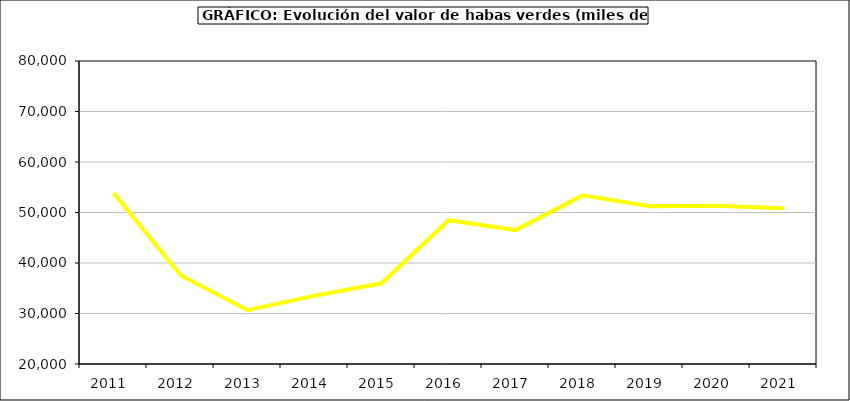
| Category | Valor |
|---|---|
| 2011.0 | 53880.612 |
| 2012.0 | 37566.616 |
| 2013.0 | 30653.095 |
| 2014.0 | 33509.136 |
| 2015.0 | 35980 |
| 2016.0 | 48480 |
| 2017.0 | 46515.376 |
| 2018.0 | 53389.01 |
| 2019.0 | 51247.117 |
| 2020.0 | 51358.243 |
| 2021.0 | 50852.815 |